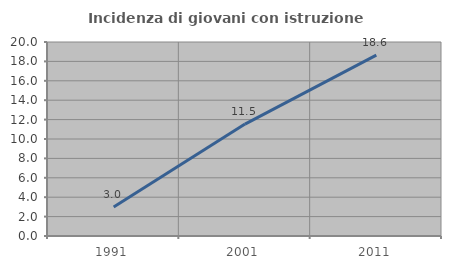
| Category | Incidenza di giovani con istruzione universitaria |
|---|---|
| 1991.0 | 2.985 |
| 2001.0 | 11.538 |
| 2011.0 | 18.644 |